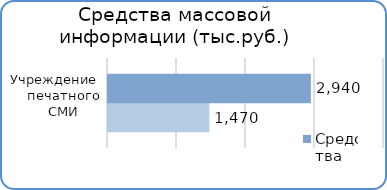
| Category | Факт | План  |
|---|---|---|
| Учреждение печатного СМИ  | 1469500 | 2940000 |